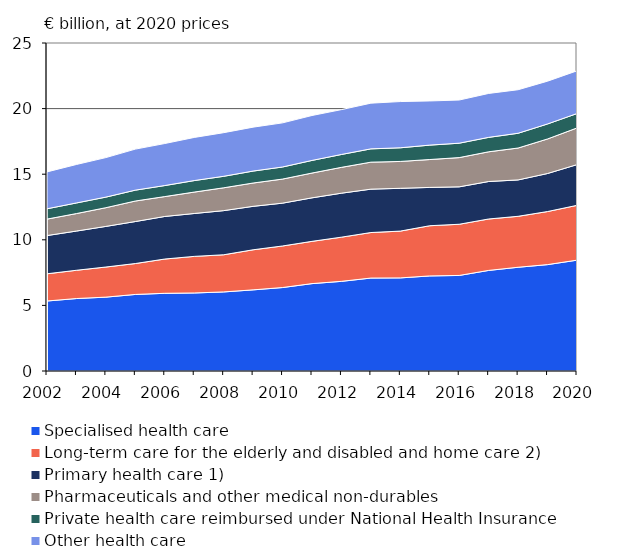
| Category | Specialised health care | Long-term care for the elderly and disabled and home care 2)  | Primary health care 1) | Pharmaceuticals and other medical non-durables | Private health care reimbursed under National Health Insurance | Other health care |
|---|---|---|---|---|---|---|
| 2002 | 5.334 | 2.075 | 2.914 | 1.252 | 0.787 | 2.812 |
| 2003 | 5.523 | 2.155 | 2.989 | 1.332 | 0.808 | 2.934 |
| 2004 | 5.63 | 2.296 | 3.096 | 1.426 | 0.806 | 3.013 |
| 2005 | 5.835 | 2.356 | 3.202 | 1.563 | 0.83 | 3.127 |
| 2006 | 5.922 | 2.611 | 3.245 | 1.515 | 0.841 | 3.203 |
| 2007 | 5.947 | 2.789 | 3.269 | 1.632 | 0.877 | 3.288 |
| 2008 | 6.027 | 2.831 | 3.365 | 1.739 | 0.877 | 3.325 |
| 2009 | 6.184 | 3.054 | 3.312 | 1.776 | 0.912 | 3.348 |
| 2010 | 6.361 | 3.168 | 3.264 | 1.836 | 0.921 | 3.363 |
| 2011 | 6.66 | 3.222 | 3.316 | 1.889 | 0.963 | 3.424 |
| 2012 | 6.832 | 3.369 | 3.352 | 1.968 | 0.982 | 3.419 |
| 2013 | 7.085 | 3.469 | 3.307 | 2.056 | 1.014 | 3.483 |
| 2014 | 7.096 | 3.566 | 3.263 | 2.046 | 1.042 | 3.524 |
| 2015 | 7.246 | 3.826 | 2.921 | 2.125 | 1.098 | 3.367 |
| 2016 | 7.283 | 3.903 | 2.852 | 2.229 | 1.097 | 3.291 |
| 2017 | 7.666 | 3.92 | 2.857 | 2.265 | 1.099 | 3.348 |
| 2018 | 7.907 | 3.884 | 2.773 | 2.431 | 1.125 | 3.318 |
| 2019 | 8.108 | 4.046 | 2.899 | 2.633 | 1.143 | 3.263 |
| 2020 | 8.448 | 4.178 | 3.105 | 2.793 | 1.1 | 3.256 |